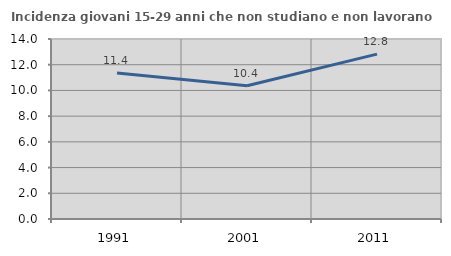
| Category | Incidenza giovani 15-29 anni che non studiano e non lavorano  |
|---|---|
| 1991.0 | 11.359 |
| 2001.0 | 10.363 |
| 2011.0 | 12.821 |